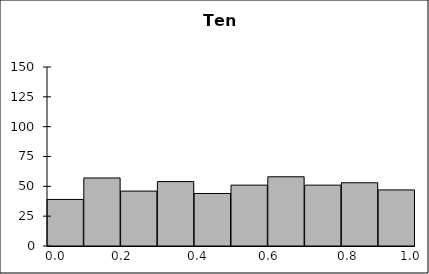
| Category | Series 1 |
|---|---|
| 0 | 39 |
| 1 | 57 |
| 2 | 46 |
| 3 | 54 |
| 4 | 44 |
| 5 | 51 |
| 6 | 58 |
| 7 | 51 |
| 8 | 53 |
| 9 | 47 |